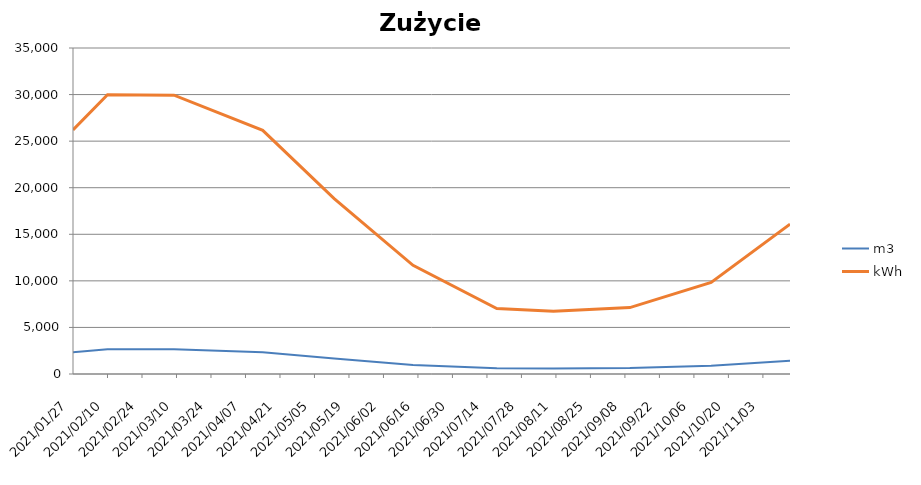
| Category | m3 | kWh |
|---|---|---|
| 2021-01-27 | 2327 | 26207 |
| 2021-02-10 | 2658 | 29980 |
| 2021-03-09 | 2657 | 29931 |
| 2021-04-14 | 2327 | 26160 |
| 2021-05-13 | 1675 | 18827 |
| 2021-06-14 | 979 | 11663 |
| 2021-07-18 | 626 | 7036 |
| 2021-08-10 | 600 | 6742 |
| 2021-09-10 | 635 | 7131 |
| 2021-10-13 | 879 | 9839 |
| 2021-11-14 | 1432 | 16093 |